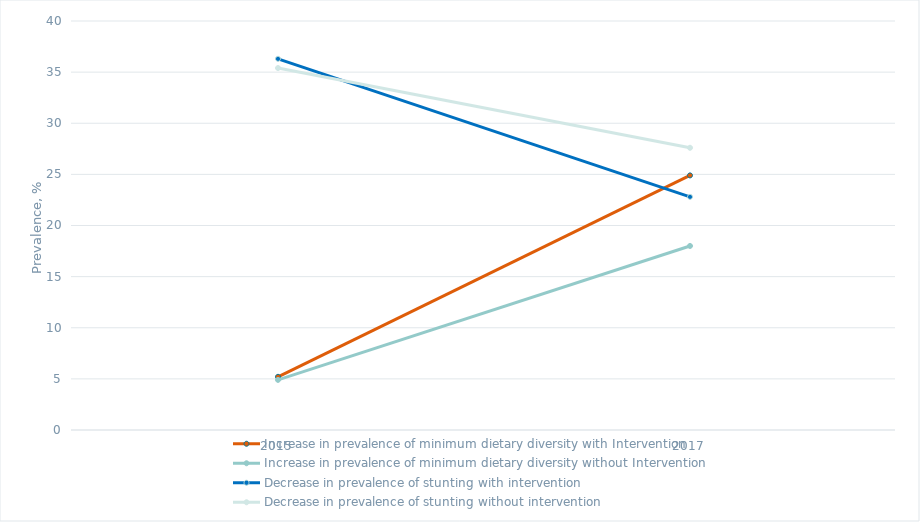
| Category | Increase in prevalence of minimum dietary diversity with Intervention | Increase in prevalence of minimum dietary diversity without Intervention | Decrease in prevalence of stunting with intervention | Decrease in prevalence of stunting without intervention |
|---|---|---|---|---|
| 2015.0 | 5.2 | 4.9 | 36.3 | 35.4 |
| 2017.0 | 24.9 | 18 | 22.8 | 27.6 |